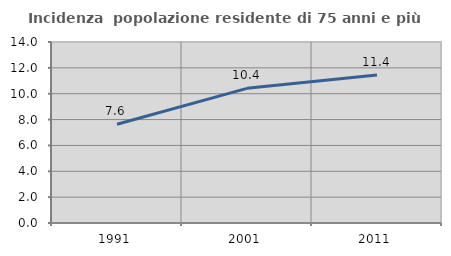
| Category | Incidenza  popolazione residente di 75 anni e più |
|---|---|
| 1991.0 | 7.634 |
| 2001.0 | 10.417 |
| 2011.0 | 11.441 |